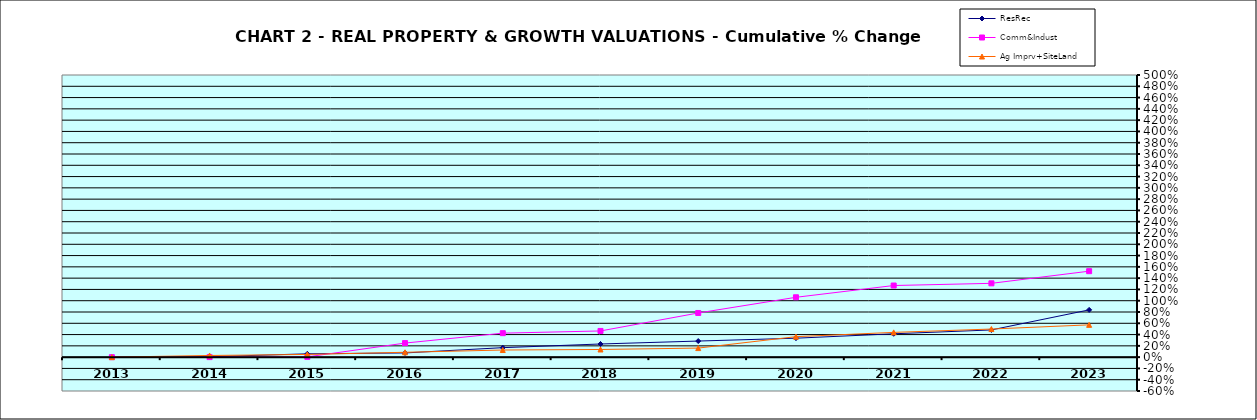
| Category | ResRec | Comm&Indust | Ag Imprv+SiteLand |
|---|---|---|---|
| 2013.0 | -0.004 | 0 | 0 |
| 2014.0 | 0.006 | 0.001 | 0.029 |
| 2015.0 | 0.059 | 0.005 | 0.048 |
| 2016.0 | 0.074 | 0.249 | 0.086 |
| 2017.0 | 0.168 | 0.425 | 0.126 |
| 2018.0 | 0.233 | 0.464 | 0.136 |
| 2019.0 | 0.285 | 0.783 | 0.16 |
| 2020.0 | 0.336 | 1.061 | 0.363 |
| 2021.0 | 0.414 | 1.269 | 0.439 |
| 2022.0 | 0.482 | 1.308 | 0.498 |
| 2023.0 | 0.838 | 1.523 | 0.572 |